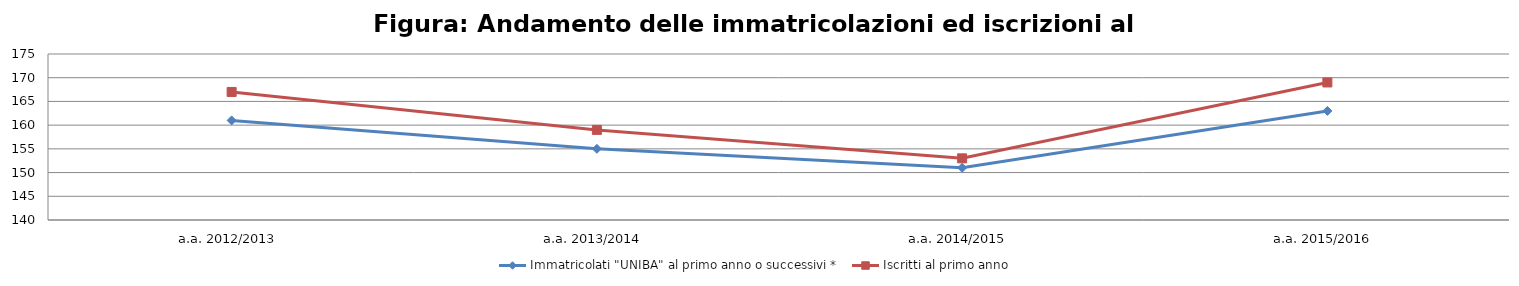
| Category | Immatricolati "UNIBA" al primo anno o successivi * | Iscritti al primo anno  |
|---|---|---|
| a.a. 2012/2013 | 161 | 167 |
| a.a. 2013/2014 | 155 | 159 |
| a.a. 2014/2015 | 151 | 153 |
| a.a. 2015/2016 | 163 | 169 |